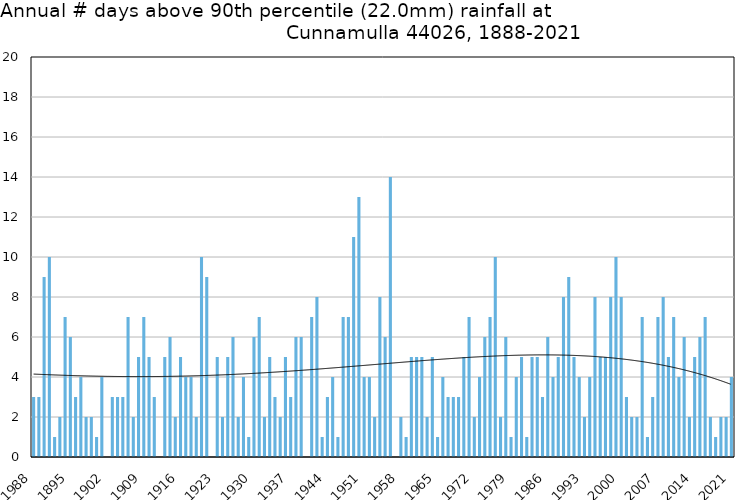
| Category | Annual # days above 90th percentile |
|---|---|
| 1988 | 3 |
| 1889 | 3 |
| 1890 | 9 |
| 1891 | 10 |
| 1892 | 1 |
| 1893 | 2 |
| 1894 | 7 |
| 1895 | 6 |
| 1896 | 3 |
| 1897 | 4 |
| 1898 | 2 |
| 1899 | 2 |
| 1900 | 1 |
| 1901 | 4 |
| 1902 | 0 |
| 1903 | 3 |
| 1904 | 3 |
| 1905 | 3 |
| 1906 | 7 |
| 1907 | 2 |
| 1908 | 5 |
| 1909 | 7 |
| 1910 | 5 |
| 1911 | 3 |
| 1912 | 0 |
| 1913 | 5 |
| 1914 | 6 |
| 1915 | 2 |
| 1916 | 5 |
| 1917 | 4 |
| 1918 | 4 |
| 1919 | 2 |
| 1920 | 10 |
| 1921 | 9 |
| 1922 | 0 |
| 1923 | 5 |
| 1924 | 2 |
| 1925 | 5 |
| 1926 | 6 |
| 1927 | 2 |
| 1928 | 4 |
| 1929 | 1 |
| 1930 | 6 |
| 1931 | 7 |
| 1932 | 2 |
| 1933 | 5 |
| 1934 | 3 |
| 1935 | 2 |
| 1936 | 5 |
| 1937 | 3 |
| 1938 | 6 |
| 1939 | 6 |
| 1940 | 0 |
| 1941 | 7 |
| 1942 | 8 |
| 1943 | 1 |
| 1944 | 3 |
| 1945 | 4 |
| 1946 | 1 |
| 1947 | 7 |
| 1948 | 7 |
| 1949 | 11 |
| 1950 | 13 |
| 1951 | 4 |
| 1952 | 4 |
| 1953 | 2 |
| 1954 | 8 |
| 1955 | 6 |
| 1956 | 14 |
| 1957 | 0 |
| 1958 | 2 |
| 1959 | 1 |
| 1960 | 5 |
| 1961 | 5 |
| 1962 | 5 |
| 1963 | 2 |
| 1964 | 5 |
| 1965 | 1 |
| 1966 | 4 |
| 1967 | 3 |
| 1968 | 3 |
| 1969 | 3 |
| 1970 | 5 |
| 1971 | 7 |
| 1972 | 2 |
| 1973 | 4 |
| 1974 | 6 |
| 1975 | 7 |
| 1976 | 10 |
| 1977 | 2 |
| 1978 | 6 |
| 1979 | 1 |
| 1980 | 4 |
| 1981 | 5 |
| 1982 | 1 |
| 1983 | 5 |
| 1984 | 5 |
| 1985 | 3 |
| 1986 | 6 |
| 1987 | 4 |
| 1988 | 5 |
| 1989 | 8 |
| 1990 | 9 |
| 1991 | 5 |
| 1992 | 4 |
| 1993 | 2 |
| 1994 | 4 |
| 1995 | 8 |
| 1996 | 5 |
| 1997 | 5 |
| 1998 | 8 |
| 1999 | 10 |
| 2000 | 8 |
| 2001 | 3 |
| 2002 | 2 |
| 2003 | 2 |
| 2004 | 7 |
| 2005 | 1 |
| 2006 | 3 |
| 2007 | 7 |
| 2008 | 8 |
| 2009 | 5 |
| 2010 | 7 |
| 2011 | 4 |
| 2012 | 6 |
| 2013 | 2 |
| 2014 | 5 |
| 2015 | 6 |
| 2016 | 7 |
| 2017 | 2 |
| 2018 | 1 |
| 2019 | 2 |
| 2020 | 2 |
| 2021 | 4 |